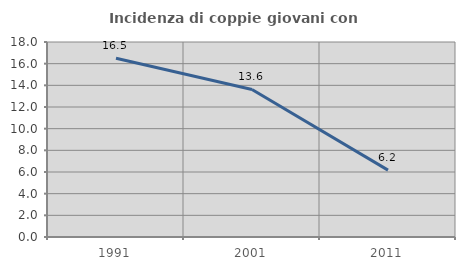
| Category | Incidenza di coppie giovani con figli |
|---|---|
| 1991.0 | 16.508 |
| 2001.0 | 13.616 |
| 2011.0 | 6.175 |